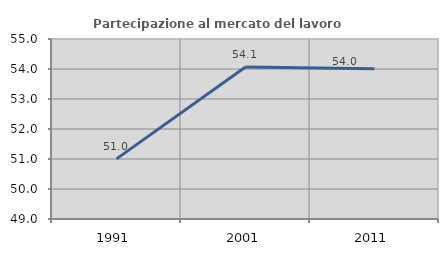
| Category | Partecipazione al mercato del lavoro  femminile |
|---|---|
| 1991.0 | 51.003 |
| 2001.0 | 54.067 |
| 2011.0 | 54.007 |